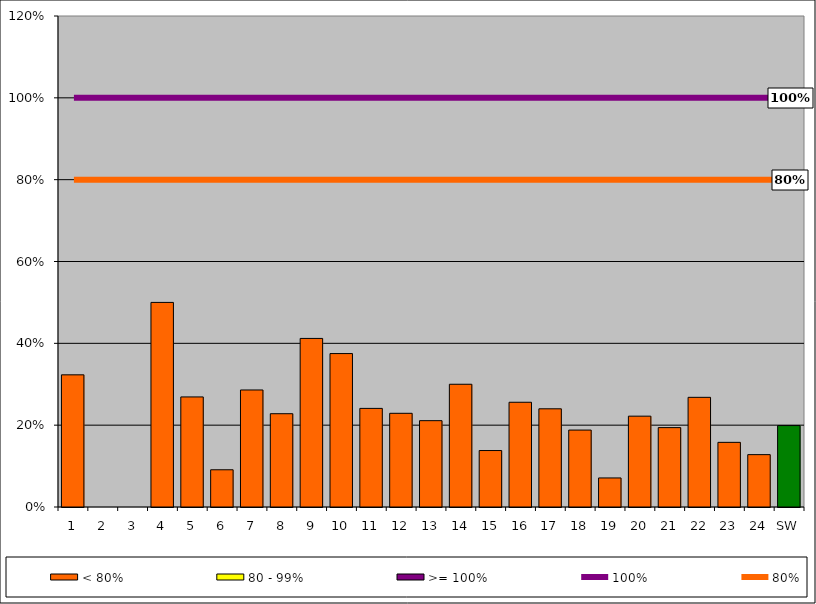
| Category | < 80% | 80 - 99% | >= 100% |
|---|---|---|---|
| 1 | 0.323 | 0 | 0 |
| 2 | 0 | 0 | 0 |
| 3 | 0 | 0 | 0 |
| 4 | 0.5 | 0 | 0 |
| 5 | 0.269 | 0 | 0 |
| 6 | 0.091 | 0 | 0 |
| 7 | 0.286 | 0 | 0 |
| 8 | 0.228 | 0 | 0 |
| 9 | 0.412 | 0 | 0 |
| 10 | 0.375 | 0 | 0 |
| 11 | 0.241 | 0 | 0 |
| 12 | 0.229 | 0 | 0 |
| 13 | 0.211 | 0 | 0 |
| 14 | 0.3 | 0 | 0 |
| 15 | 0.138 | 0 | 0 |
| 16 | 0.256 | 0 | 0 |
| 17 | 0.24 | 0 | 0 |
| 18 | 0.188 | 0 | 0 |
| 19 | 0.071 | 0 | 0 |
| 20 | 0.222 | 0 | 0 |
| 21 | 0.194 | 0 | 0 |
| 22 | 0.268 | 0 | 0 |
| 23 | 0.158 | 0 | 0 |
| 24 | 0.128 | 0 | 0 |
| SW | 0.199 | 0 | 0 |